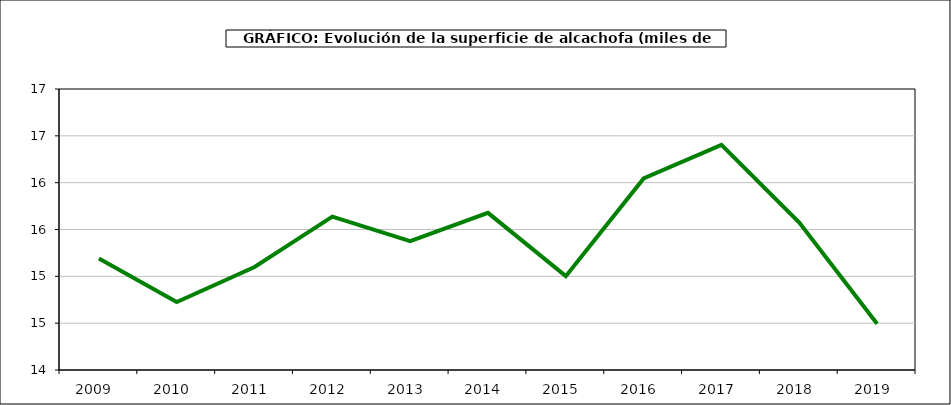
| Category | superficie |
|---|---|
| 2009.0 | 15.19 |
| 2010.0 | 14.726 |
| 2011.0 | 15.1 |
| 2012.0 | 15.638 |
| 2013.0 | 15.376 |
| 2014.0 | 15.678 |
| 2015.0 | 15.002 |
| 2016.0 | 16.045 |
| 2017.0 | 16.403 |
| 2018.0 | 15.575 |
| 2019.0 | 14.493 |